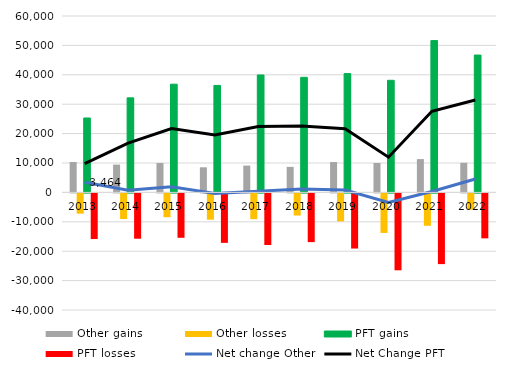
| Category | Other gains | Other losses | PFT gains | PFT losses |
|---|---|---|---|---|
| 2013.0 | 10346 | -6882 | 25315 | -15528 |
| 2014.0 | 9449 | -8718 | 32166 | -15413 |
| 2015.0 | 9988 | -8096 | 36803 | -15099 |
| 2016.0 | 8536 | -8938 | 36382 | -16826 |
| 2017.0 | 9117 | -8754 | 39947 | -17561 |
| 2018.0 | 8681 | -7533 | 39145 | -16574 |
| 2019.0 | 10328 | -9524 | 40414 | -18758 |
| 2020.0 | 10010 | -13449 | 38134 | -26152 |
| 2021.0 | 11330 | -11000 | 51637 | -24050 |
| 2022.0 | 10067 | -5505 | 46719 | -15290 |